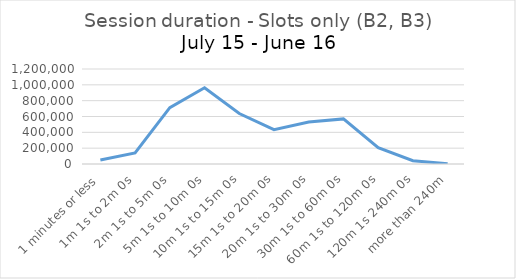
| Category | Slots only (B2, B3) |
|---|---|
| 1 minutes or less | 49368 |
| 1m 1s to 2m 0s | 139156 |
| 2m 1s to 5m 0s | 711630 |
| 5m 1s to 10m 0s | 963484 |
| 10m 1s to 15m 0s | 637019 |
| 15m 1s to 20m 0s | 434607 |
| 20m 1s to 30m 0s | 529922 |
| 30m 1s to 60m 0s | 569861 |
| 60m 1s to 120m 0s | 206132 |
| 120m 1s 240m 0s | 41260 |
| more than 240m | 4166 |